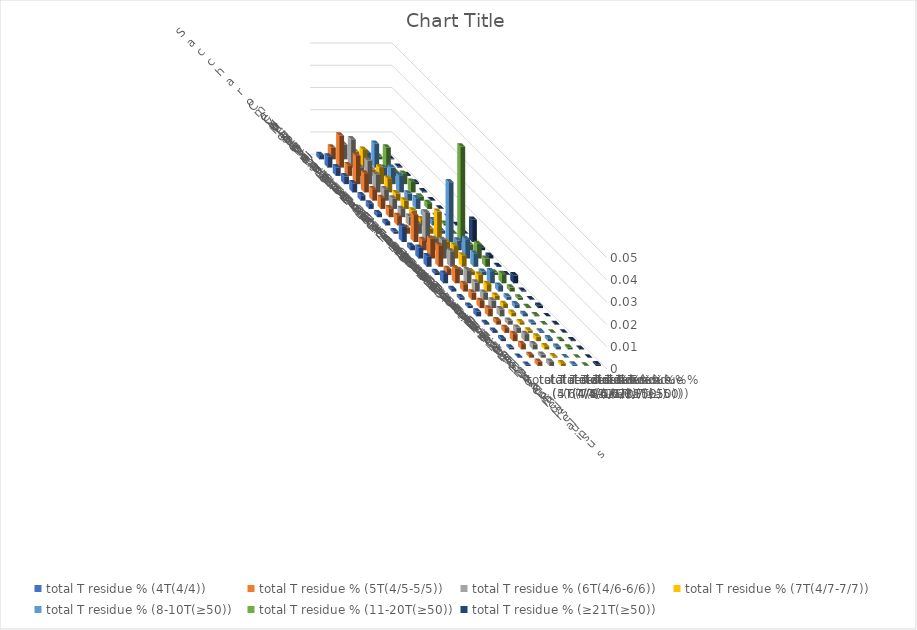
| Category | total T residue % (4T(4/4)) | total T residue % (5T(4/5-5/5)) | total T residue % (6T(4/6-6/6)) | total T residue % (7T(4/7-7/7)) | total T residue % (8-10T(≥50)) | total T residue % (11-20T(≥50)) | total T residue % (≥21T(≥50)) |
|---|---|---|---|---|---|---|---|
| Saccharomyces cerevisiae S288c | 0.002 | 0.005 | 0.007 | 0.003 | 0.003 | 0.001 | 0 |
| Candida albicans | 0.005 | 0.014 | 0.013 | 0.008 | 0.011 | 0.009 | 0 |
| Candida auris | 0.004 | 0.005 | 0.004 | 0.003 | 0.004 | 0.002 | 0 |
| Candida tropicalis | 0.004 | 0.013 | 0.011 | 0.008 | 0.007 | 0.005 | 0.001 |
| Neurospora crassa | 0.004 | 0.009 | 0.008 | 0.006 | 0.007 | 0.005 | 0 |
| Magnaporthe oryzae | 0.002 | 0.005 | 0.005 | 0.003 | 0.003 | 0.002 | 0 |
| Trichoderma reesei | 0.002 | 0.005 | 0.005 | 0.004 | 0.005 | 0.003 | 0 |
| Cryptococcus neoformans | 0.002 | 0.004 | 0.004 | 0.003 | 0.002 | 0 | 0 |
| Ustilago maydis | 0.002 | 0.004 | 0.004 | 0.003 | 0.002 | 0.001 | 0 |
| Taiwanofungus camphoratus | 0.001 | 0.003 | 0.004 | 0.002 | 0.001 | 0 | 0 |
| Dictyostelium discoideum | 0.007 | 0.012 | 0.013 | 0.014 | 0.027 | 0.043 | 0.01 |
| Chlamydomonas reinhardtii | 0.002 | 0.005 | 0.005 | 0.004 | 0.004 | 0.003 | 0.001 |
| Drosophila melanogaster | 0.005 | 0.009 | 0.008 | 0.006 | 0.009 | 0.007 | 0.001 |
| Aedes aegypti | 0.005 | 0.01 | 0.007 | 0.005 | 0.006 | 0.004 | 0 |
| Plasmodium falciparum | 0.001 | 0.003 | 0.002 | 0.002 | 0.001 | 0.001 | 0 |
| Caenorhabditis elegans | 0.004 | 0.007 | 0.006 | 0.004 | 0.005 | 0.004 | 0.004 |
| Danio rerio | 0.001 | 0.003 | 0.004 | 0.003 | 0.003 | 0.002 | 0 |
| Mus musculus | 0.001 | 0.003 | 0.003 | 0.002 | 0.001 | 0.001 | 0 |
| Homo sapiens | 0.001 | 0.003 | 0.003 | 0.002 | 0.002 | 0 | 0.001 |
| Arabidopsis thaliana | 0.002 | 0.004 | 0.003 | 0.002 | 0.001 | 0.001 | 0 |
| Tetrahymena thermophila | 0.001 | 0.002 | 0.002 | 0.001 | 0.001 | 0 | 0 |
| Paramecium tetraurelia | 0.001 | 0.002 | 0.002 | 0.001 | 0.001 | 0 | 0 |
| Oxytricha trifallax | 0.001 | 0.003 | 0.003 | 0.002 | 0.001 | 0.001 | 0 |
| Stylonychia lemnae | 0.001 | 0.002 | 0.002 | 0.001 | 0.001 | 0.001 | 0 |
| Pseudocohnilembus persalinus | 0 | 0.001 | 0.001 | 0.001 | 0 | 0 | 0 |
| Stentor coeruleus | 0.001 | 0.002 | 0.002 | 0.001 | 0.001 | 0 | 0.001 |